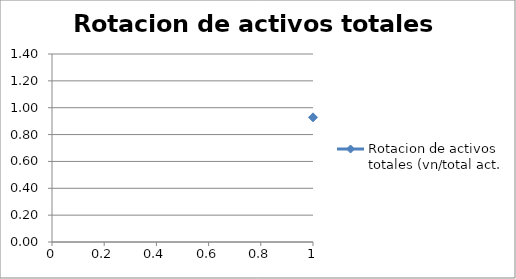
| Category | Rotacion de activos totales (vn/total act. |
|---|---|
| 0 | 0.928 |
| 1 | 0.926 |
| 2 | 0.967 |
| 3 | 0.967 |
| 4 | 0.926 |
| 5 | 0.927 |
| 6 | 0.967 |
| 7 | 1.266 |